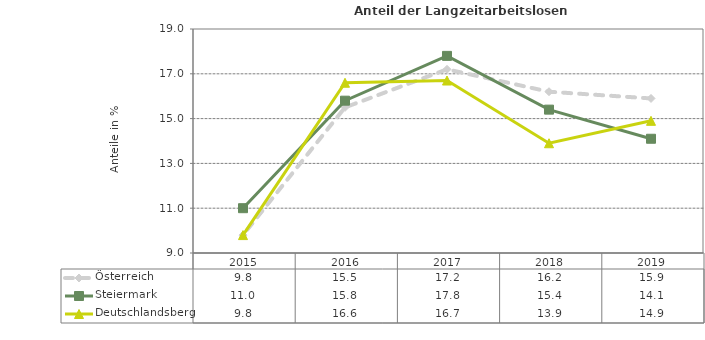
| Category | Österreich | Steiermark | Deutschlandsberg |
|---|---|---|---|
| 2019.0 | 15.9 | 14.1 | 14.9 |
| 2018.0 | 16.2 | 15.4 | 13.9 |
| 2017.0 | 17.2 | 17.8 | 16.7 |
| 2016.0 | 15.5 | 15.8 | 16.6 |
| 2015.0 | 9.8 | 11 | 9.8 |